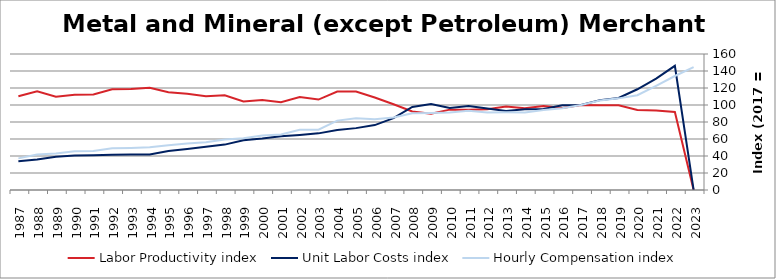
| Category | Labor Productivity index | Unit Labor Costs index | Hourly Compensation index |
|---|---|---|---|
| 2023.0 | 0 | 0 | 144.598 |
| 2022.0 | 91.785 | 146.1 | 134.097 |
| 2021.0 | 93.498 | 131.038 | 122.518 |
| 2020.0 | 94.114 | 118.524 | 111.547 |
| 2019.0 | 99.63 | 108.206 | 107.805 |
| 2018.0 | 99.628 | 105.75 | 105.356 |
| 2017.0 | 100 | 100 | 100 |
| 2016.0 | 96.45 | 99.711 | 96.171 |
| 2015.0 | 98.873 | 95.245 | 94.172 |
| 2014.0 | 96.08 | 95.045 | 91.319 |
| 2013.0 | 98.303 | 93.041 | 91.462 |
| 2012.0 | 95.077 | 95.976 | 91.251 |
| 2011.0 | 94.369 | 98.827 | 93.261 |
| 2010.0 | 94.539 | 96.54 | 91.268 |
| 2009.0 | 89.651 | 101.165 | 90.695 |
| 2008.0 | 92.335 | 97.76 | 90.267 |
| 2007.0 | 100.899 | 84.551 | 85.311 |
| 2006.0 | 108.873 | 76.353 | 83.128 |
| 2005.0 | 115.849 | 72.792 | 84.33 |
| 2004.0 | 115.86 | 70.464 | 81.639 |
| 2003.0 | 106.395 | 66.623 | 70.884 |
| 2002.0 | 109.262 | 64.767 | 70.766 |
| 2001.0 | 103.313 | 63.271 | 65.367 |
| 2000.0 | 105.796 | 60.543 | 64.052 |
| 1999.0 | 104.252 | 58.499 | 60.987 |
| 1998.0 | 111.462 | 53.404 | 59.526 |
| 1997.0 | 110.415 | 50.94 | 56.245 |
| 1996.0 | 113.187 | 48.21 | 54.568 |
| 1995.0 | 115.133 | 45.841 | 52.778 |
| 1994.0 | 120.284 | 41.711 | 50.172 |
| 1993.0 | 118.829 | 41.634 | 49.474 |
| 1992.0 | 118.575 | 41.426 | 49.121 |
| 1991.0 | 112.316 | 40.839 | 45.869 |
| 1990.0 | 112.062 | 40.578 | 45.472 |
| 1989.0 | 109.642 | 39.136 | 42.91 |
| 1988.0 | 116.031 | 35.886 | 41.639 |
| 1987.0 | 110.348 | 33.706 | 37.194 |